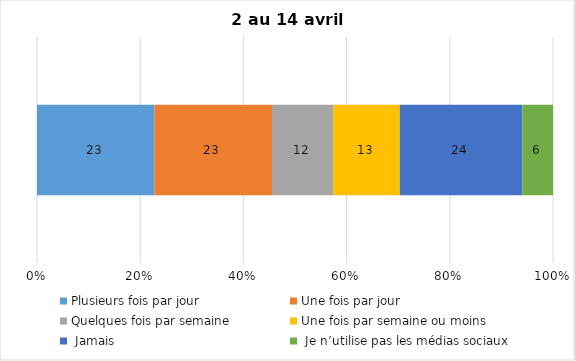
| Category | Plusieurs fois par jour | Une fois par jour | Quelques fois par semaine   | Une fois par semaine ou moins   |  Jamais   |  Je n’utilise pas les médias sociaux |
|---|---|---|---|---|---|---|
| 0 | 23 | 23 | 12 | 13 | 24 | 6 |